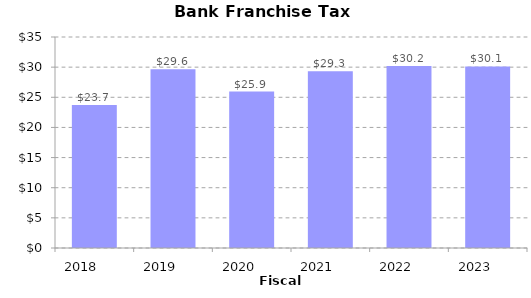
| Category | Series 0 |
|---|---|
| 2018.0 | 23724800 |
| 2019.0 | 29641360 |
| 2020.0 | 25949060 |
| 2021.0 | 29336130 |
| 2022.0 | 30170420 |
| 2023.0 | 30120070 |